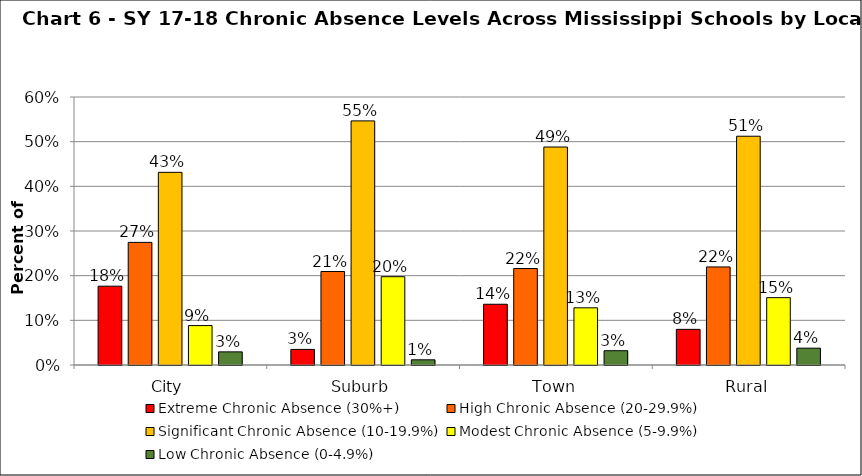
| Category | Extreme Chronic Absence (30%+) | High Chronic Absence (20-29.9%) | Significant Chronic Absence (10-19.9%) | Modest Chronic Absence (5-9.9%) | Low Chronic Absence (0-4.9%) |
|---|---|---|---|---|---|
| 0 | 0.176 | 0.275 | 0.431 | 0.088 | 0.029 |
| 1 | 0.035 | 0.209 | 0.547 | 0.198 | 0.012 |
| 2 | 0.136 | 0.216 | 0.488 | 0.128 | 0.032 |
| 3 | 0.08 | 0.22 | 0.512 | 0.151 | 0.038 |